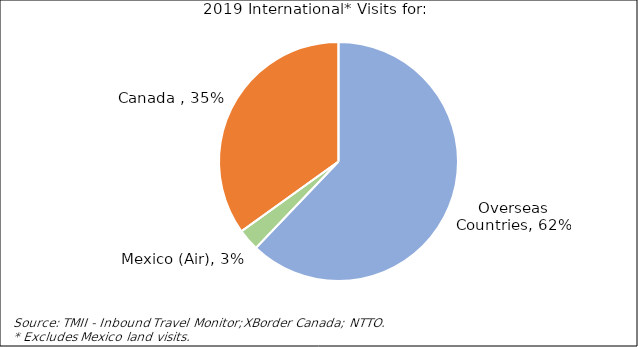
| Category | Series 0 |
|---|---|
| Overseas Countries | 0.621 |
| Mexico (Air) | 0.03 |
| Canada  | 0.349 |